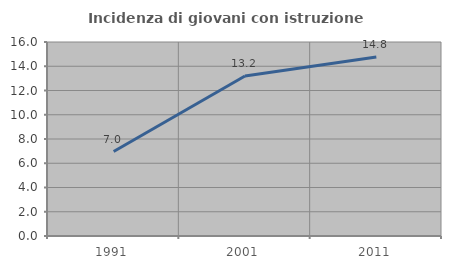
| Category | Incidenza di giovani con istruzione universitaria |
|---|---|
| 1991.0 | 6.966 |
| 2001.0 | 13.199 |
| 2011.0 | 14.758 |